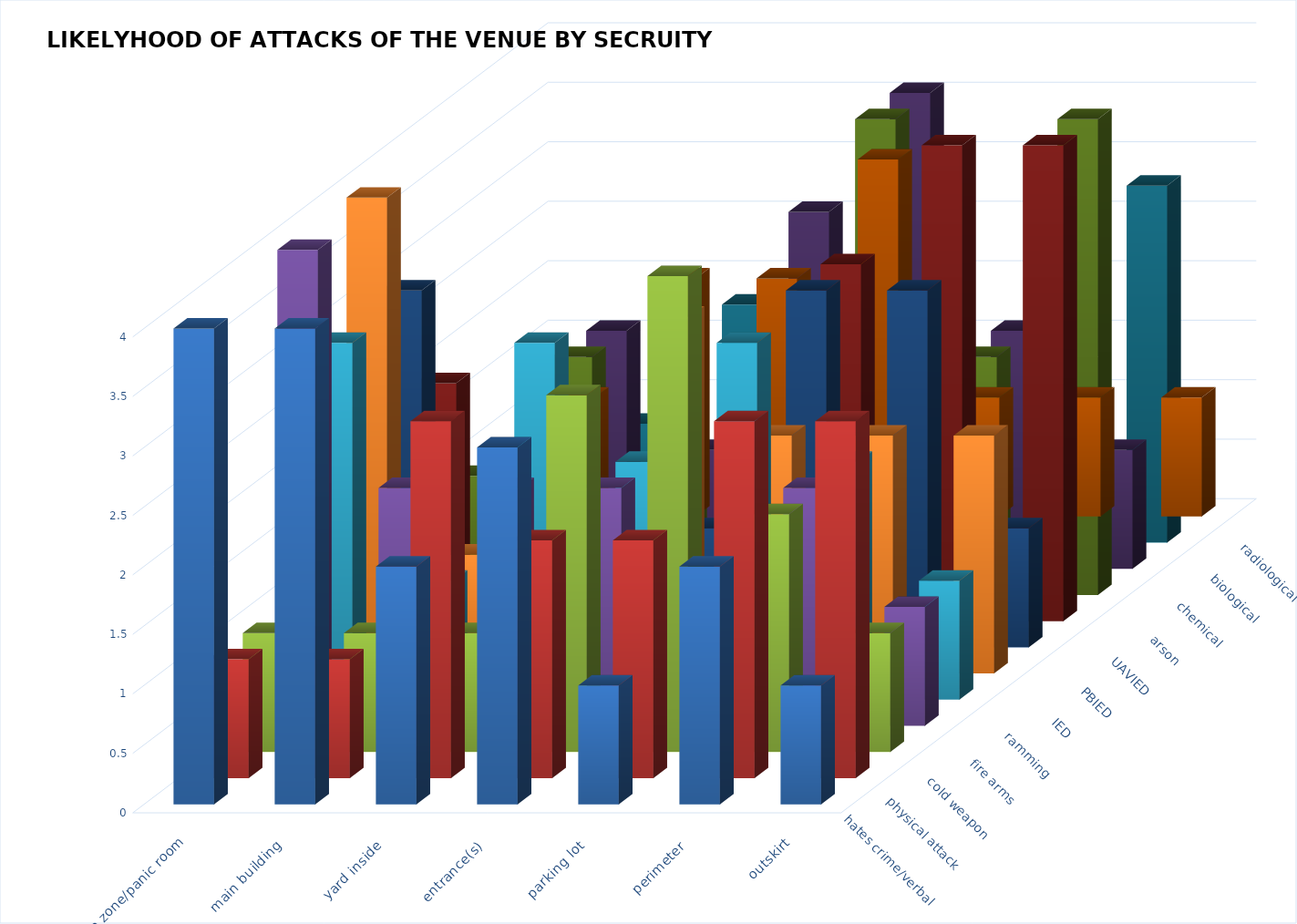
| Category | hates crime/verbal | physical attack | cold weapon | fire arms | ramming | IED | PBIED | UAVIED | arson | chemical | biological | radiological |
|---|---|---|---|---|---|---|---|---|---|---|---|---|
| safe zone/panic room | 4 | 1 | 1 | 4 | 3 | 4 | 3 | 2 | 1 | 1 | 1 | 1 |
| main building | 4 | 1 | 1 | 2 | 1 | 1 | 1 | 1 | 2 | 2 | 2 | 1 |
| yard inside | 2 | 3 | 1 | 2 | 3 | 1 | 1 | 1 | 2 | 1 | 1 | 2 |
| entrance(s) | 3 | 2 | 3 | 2 | 2 | 3 | 1 | 1 | 3 | 2 | 3 | 2 |
| parking lot | 1 | 2 | 4 | 1 | 3 | 2 | 3 | 3 | 1 | 4 | 4 | 1 |
| perimeter | 2 | 3 | 2 | 2 | 2 | 2 | 3 | 4 | 1 | 2 | 2 | 1 |
| outskirt | 1 | 3 | 1 | 1 | 1 | 2 | 1 | 4 | 1 | 4 | 1 | 3 |